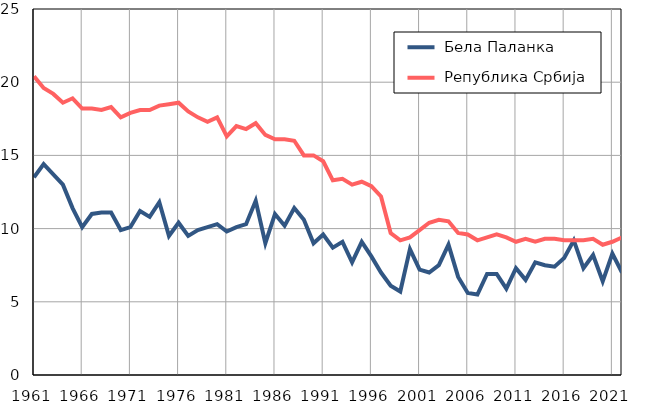
| Category |  Бела Паланка |  Република Србија |
|---|---|---|
| 1961.0 | 13.5 | 20.4 |
| 1962.0 | 14.4 | 19.6 |
| 1963.0 | 13.7 | 19.2 |
| 1964.0 | 13 | 18.6 |
| 1965.0 | 11.4 | 18.9 |
| 1966.0 | 10.1 | 18.2 |
| 1967.0 | 11 | 18.2 |
| 1968.0 | 11.1 | 18.1 |
| 1969.0 | 11.1 | 18.3 |
| 1970.0 | 9.9 | 17.6 |
| 1971.0 | 10.1 | 17.9 |
| 1972.0 | 11.2 | 18.1 |
| 1973.0 | 10.8 | 18.1 |
| 1974.0 | 11.8 | 18.4 |
| 1975.0 | 9.5 | 18.5 |
| 1976.0 | 10.4 | 18.6 |
| 1977.0 | 9.5 | 18 |
| 1978.0 | 9.9 | 17.6 |
| 1979.0 | 10.1 | 17.3 |
| 1980.0 | 10.3 | 17.6 |
| 1981.0 | 9.8 | 16.3 |
| 1982.0 | 10.1 | 17 |
| 1983.0 | 10.3 | 16.8 |
| 1984.0 | 11.9 | 17.2 |
| 1985.0 | 9 | 16.4 |
| 1986.0 | 11 | 16.1 |
| 1987.0 | 10.2 | 16.1 |
| 1988.0 | 11.4 | 16 |
| 1989.0 | 10.6 | 15 |
| 1990.0 | 9 | 15 |
| 1991.0 | 9.6 | 14.6 |
| 1992.0 | 8.7 | 13.3 |
| 1993.0 | 9.1 | 13.4 |
| 1994.0 | 7.7 | 13 |
| 1995.0 | 9.1 | 13.2 |
| 1996.0 | 8.1 | 12.9 |
| 1997.0 | 7 | 12.2 |
| 1998.0 | 6.1 | 9.7 |
| 1999.0 | 5.7 | 9.2 |
| 2000.0 | 8.6 | 9.4 |
| 2001.0 | 7.2 | 9.9 |
| 2002.0 | 7 | 10.4 |
| 2003.0 | 7.5 | 10.6 |
| 2004.0 | 8.9 | 10.5 |
| 2005.0 | 6.7 | 9.7 |
| 2006.0 | 5.6 | 9.6 |
| 2007.0 | 5.5 | 9.2 |
| 2008.0 | 6.9 | 9.4 |
| 2009.0 | 6.9 | 9.6 |
| 2010.0 | 5.9 | 9.4 |
| 2011.0 | 7.3 | 9.1 |
| 2012.0 | 6.5 | 9.3 |
| 2013.0 | 7.7 | 9.1 |
| 2014.0 | 7.5 | 9.3 |
| 2015.0 | 7.4 | 9.3 |
| 2016.0 | 8 | 9.2 |
| 2017.0 | 9.2 | 9.2 |
| 2018.0 | 7.3 | 9.2 |
| 2019.0 | 8.2 | 9.3 |
| 2020.0 | 6.4 | 8.9 |
| 2021.0 | 8.3 | 9.1 |
| 2022.0 | 7 | 9.4 |